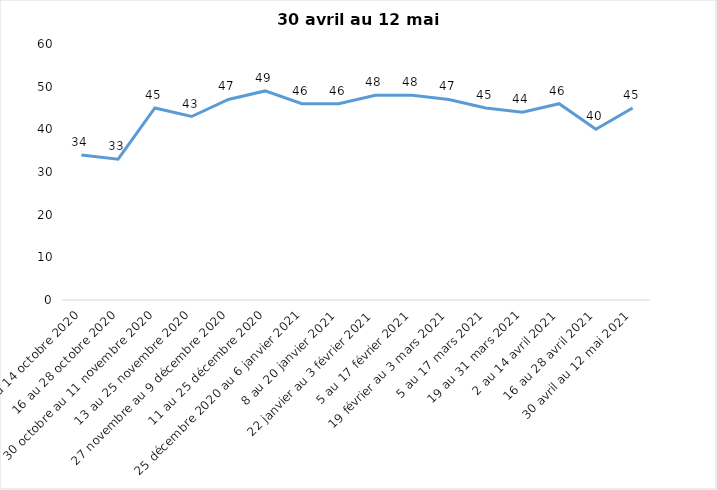
| Category | Toujours aux trois mesures |
|---|---|
| 2 au 14 octobre 2020 | 34 |
| 16 au 28 octobre 2020 | 33 |
| 30 octobre au 11 novembre 2020 | 45 |
| 13 au 25 novembre 2020 | 43 |
| 27 novembre au 9 décembre 2020 | 47 |
| 11 au 25 décembre 2020 | 49 |
| 25 décembre 2020 au 6 janvier 2021 | 46 |
| 8 au 20 janvier 2021 | 46 |
| 22 janvier au 3 février 2021 | 48 |
| 5 au 17 février 2021 | 48 |
| 19 février au 3 mars 2021 | 47 |
| 5 au 17 mars 2021 | 45 |
| 19 au 31 mars 2021 | 44 |
| 2 au 14 avril 2021 | 46 |
| 16 au 28 avril 2021 | 40 |
| 30 avril au 12 mai 2021 | 45 |